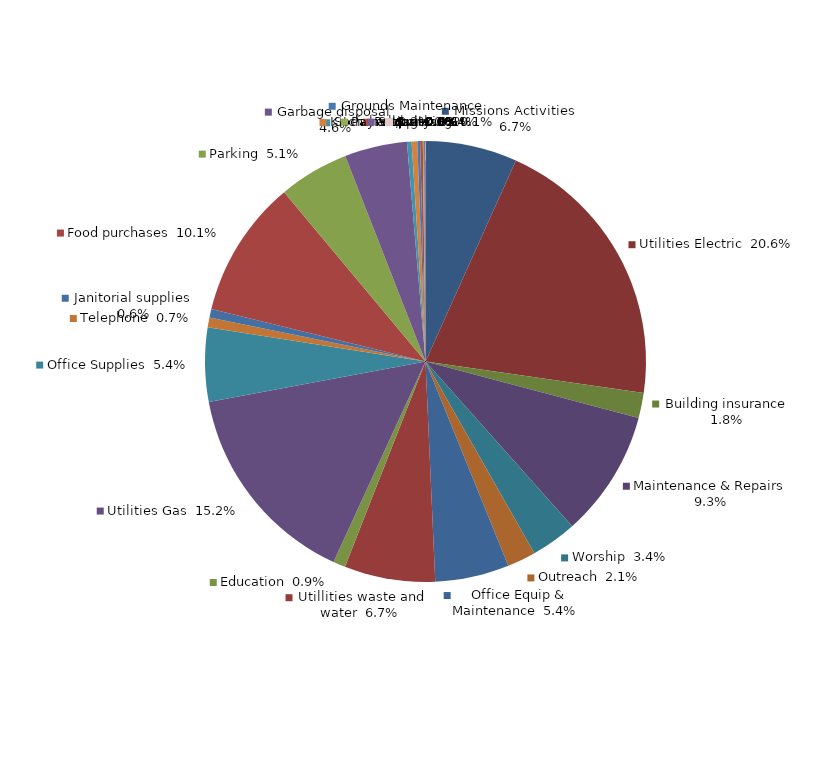
| Category | Series 0 |
|---|---|
|  Missions Activities  | 0.067 |
|  Utilities Electric  | 0.206 |
|  Building insurance  | 0.018 |
|  Maintenance & Repairs  | 0.093 |
|  Worship  | 0.034 |
|  Outreach  | 0.021 |
|  Office Equip & Maintenance  | 0.054 |
|  Utillities waste and water  | 0.067 |
|  Education  | 0.009 |
|  Utilities Gas  | 0.152 |
|  Office Supplies  | 0.054 |
|  Telephone  | 0.007 |
|  Janitorial supplies  | 0.006 |
|  Food purchases  | 0.101 |
|  Parking  | 0.051 |
|  Garbage disposal  | 0.046 |
|  Social action  | 0.003 |
|  Kitchen supplies  | 0.004 |
|  Grounds Maintenance  | 0.002 |
|  Postage  | 0.002 |
|  Payroll/banking  | 0.001 |
|  Security  | 0.001 |
|  $-    | 0 |
|  $-    | 0 |
|  $-    | 0 |
|  $-    | 0 |
|  $-    | 0 |
|  $-    | 0 |
|  $-    | 0 |
|  $-    | 0 |
|  $-    | 0 |
|  $-    | 0 |
|  $-    | 0 |
|  $-    | 0 |
|  $-    | 0 |
|  $-    | 0 |
|  $-    | 0 |
|  $-    | 0 |
|  $-    | 0 |
|  $-    | 0 |
|  $-    | 0 |
|  $-    | 0 |
|  $-    | 0 |
|  $-    | 0 |
|  $-    | 0 |
|  $-    | 0 |
|  $-    | 0 |
|  $-    | 0 |
|  $-    | 0 |
|  $-    | 0 |